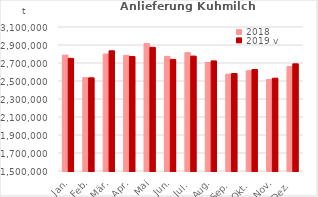
| Category | 2018 | 2019 v |
|---|---|---|
| Jan. | 2787812.896 | 2751690.319 |
| Feb. | 2537624.466 | 2535218.586 |
| Mär. | 2800162.061 | 2835643.778 |
| Apr. | 2785259.633 | 2772642.525 |
| Mai | 2917854.224 | 2874223.58 |
| Jun. | 2774049.245 | 2739985.123 |
| Jul. | 2814838.576 | 2776629.561 |
| Aug. | 2705615.526 | 2723374.265 |
| Sep. | 2575598.611 | 2583170.333 |
| Okt. | 2614142.934 | 2627632.241 |
| Nov. | 2516678.49 | 2531215.698 |
| Dez. | 2661309.882 | 2690785.319 |